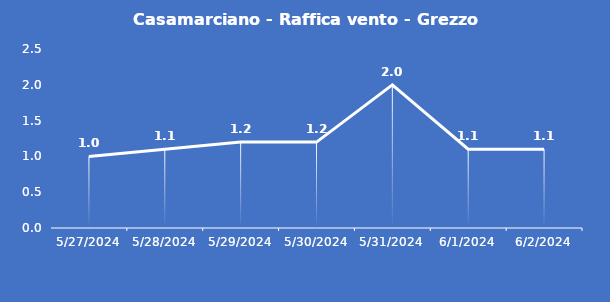
| Category | Casamarciano - Raffica vento - Grezzo (m/s) |
|---|---|
| 5/27/24 | 1 |
| 5/28/24 | 1.1 |
| 5/29/24 | 1.2 |
| 5/30/24 | 1.2 |
| 5/31/24 | 2 |
| 6/1/24 | 1.1 |
| 6/2/24 | 1.1 |